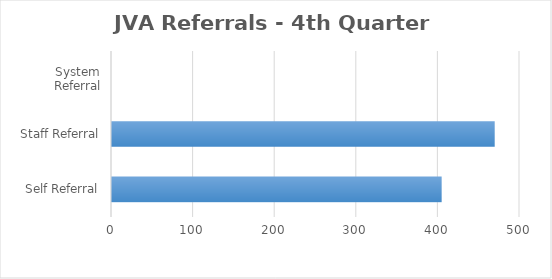
| Category | Series 0 |
|---|---|
| Self Referral | 404 |
| Staff Referral | 469 |
| System Referral | 0 |